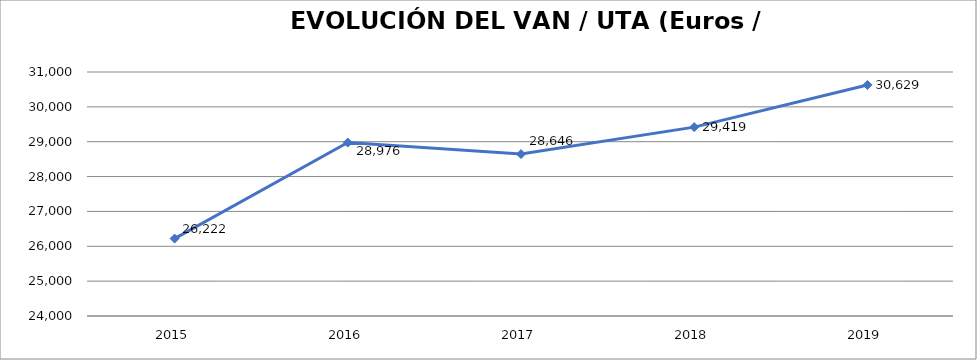
| Category | 2015 |
|---|---|
| 2015.0 | 26221.535 |
| 2016.0 | 28975.959 |
| 2017.0 | 28646.454 |
| 2018.0 | 29418.539 |
| 2019.0 | 30629.086 |